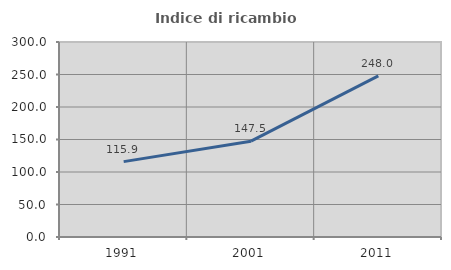
| Category | Indice di ricambio occupazionale  |
|---|---|
| 1991.0 | 115.943 |
| 2001.0 | 147.47 |
| 2011.0 | 247.954 |